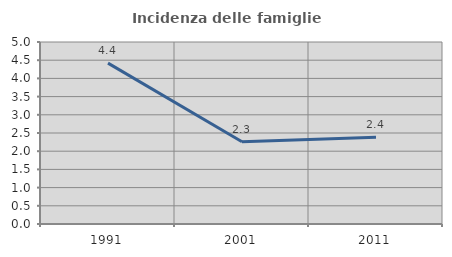
| Category | Incidenza delle famiglie numerose |
|---|---|
| 1991.0 | 4.42 |
| 2001.0 | 2.258 |
| 2011.0 | 2.385 |